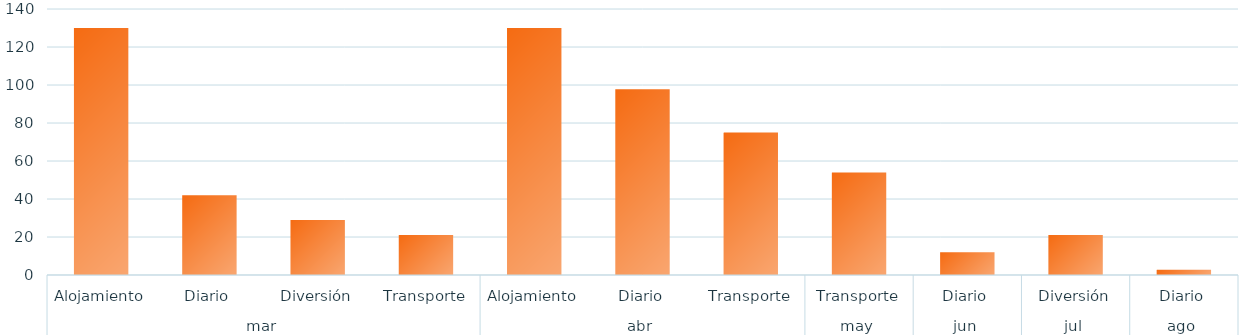
| Category | Total |
|---|---|
| 0 | 130 |
| 1 | 42 |
| 2 | 29 |
| 3 | 21 |
| 4 | 130 |
| 5 | 97.75 |
| 6 | 75 |
| 7 | 54 |
| 8 | 12 |
| 9 | 21 |
| 10 | 2.75 |